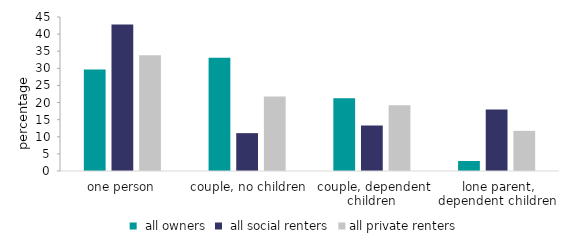
| Category |  all owners |  all social renters | all private renters |
|---|---|---|---|
| one person | 29.651 | 42.81 | 33.84 |
|  couple, no children | 33.083 | 11.06 | 21.771 |
|  couple, dependent children | 21.279 | 13.292 | 19.235 |
|  lone parent, dependent children | 2.927 | 17.968 | 11.731 |